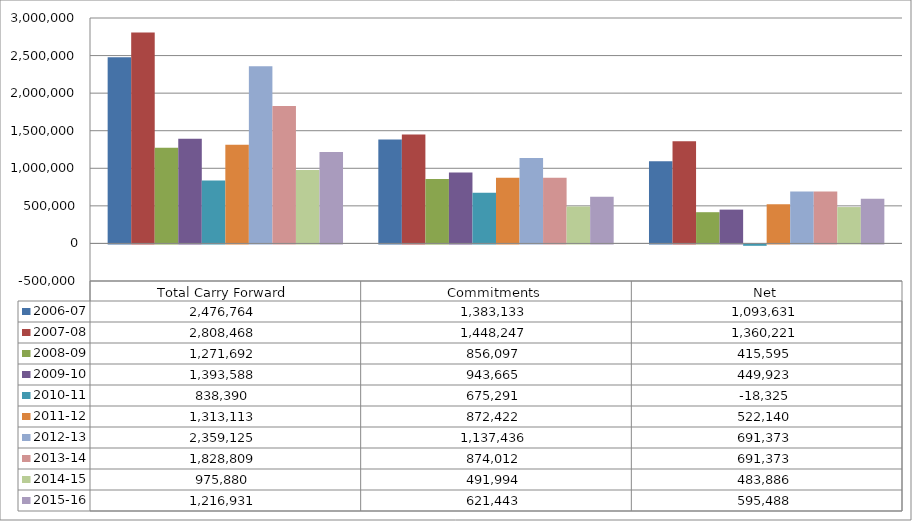
| Category | 2006-07 | 2007-08 | 2008-09 | 2009-10 | 2010-11 | 2011-12 | 2012-13 | 2013-14 | 2014-15 | 2015-16 |
|---|---|---|---|---|---|---|---|---|---|---|
| Total Carry Forward | 2476763.63 | 2808468 | 1271692.25 | 1393588.45 | 838390 | 1313113 | 2359125 | 1828809 | 975879.51 | 1216931 |
| Commitments | 1383133 | 1448247 | 856097 | 943665.08 | 675291 | 872422 | 1137436 | 874012 | 491993.5 | 621443 |
| Net | 1093630.63 | 1360221 | 415595.25 | 449923.37 | -18325 | 522140 | 691373 | 691373 | 483886.01 | 595488 |